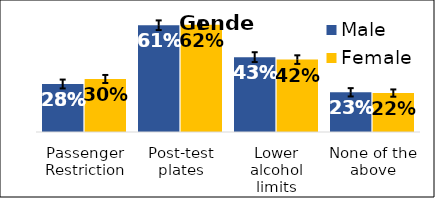
| Category | Male | Female |
|---|---|---|
| Passenger Restriction | 0.275 | 0.304 |
| Post-test plates | 0.613 | 0.616 |
| Lower alcohol limits | 0.43 | 0.415 |
| None of the above | 0.228 | 0.223 |